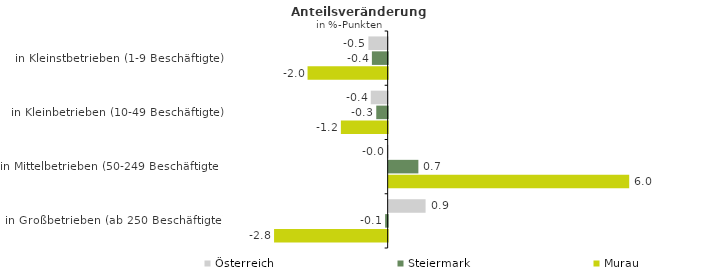
| Category | Österreich | Steiermark | Murau |
|---|---|---|---|
| in Kleinstbetrieben (1-9 Beschäftigte) | -0.48 | -0.393 | -1.995 |
| in Kleinbetrieben (10-49 Beschäftigte) | -0.42 | -0.284 | -1.165 |
| in Mittelbetrieben (50-249 Beschäftigte) | -0.019 | 0.74 | 5.989 |
| in Großbetrieben (ab 250 Beschäftigte) | 0.919 | -0.063 | -2.828 |